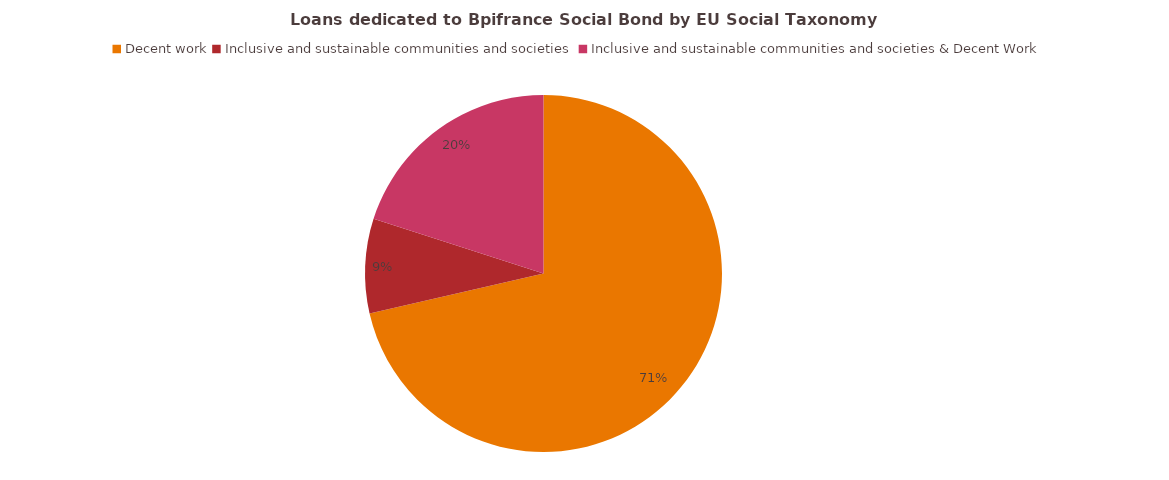
| Category | %  |
|---|---|
| Decent work | 0.714 |
| Inclusive and sustainable communities and societies | 0.086 |
| Inclusive and sustainable communities and societies & Decent Work | 0.2 |